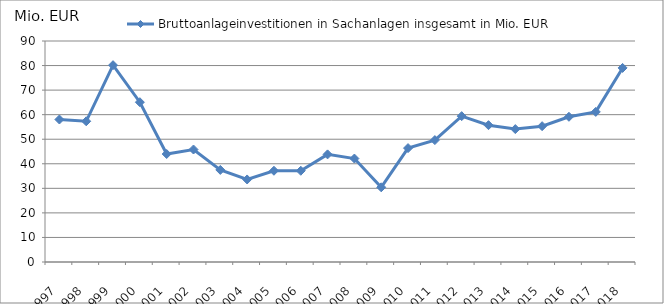
| Category | Bruttoanlageinvestitionen in Sachanlagen insgesamt in Mio. EUR |
|---|---|
| 1997.0 | 58.03 |
| 1998.0 | 57.307 |
| 1999.0 | 80.155 |
| 2000.0 | 65.078 |
| 2001.0 | 43.973 |
| 2002.0 | 45.812 |
| 2003.0 | 37.496 |
| 2004.0 | 33.615 |
| 2005.0 | 37.159 |
| 2006.0 | 37.16 |
| 2007.0 | 43.825 |
| 2008.0 | 42.134 |
| 2009.0 | 30.418 |
| 2010.0 | 46.387 |
| 2011.0 | 49.643 |
| 2012.0 | 59.396 |
| 2013.0 | 55.726 |
| 2014.0 | 54.126 |
| 2015.0 | 55.311 |
| 2016.0 | 59.135 |
| 2017.0 | 61.128 |
| 2018.0 | 79.04 |